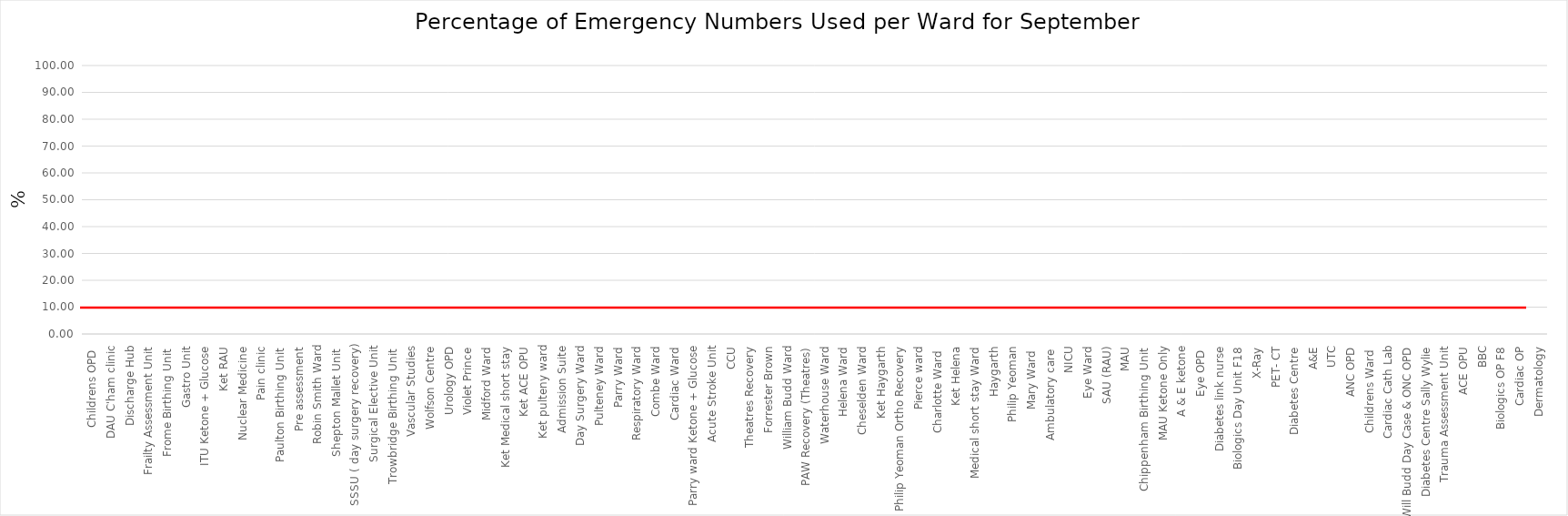
| Category | Series 0 |
|---|---|
| Childrens OPD  | 0 |
| DAU C'ham clinic | 0 |
| Discharge Hub | 0 |
| Frailty Assessment Unit | 0 |
| Frome Birthing Unit  | 0 |
| Gastro Unit | 0 |
| ITU Ketone + Glucose | 0 |
| Ket RAU | 0 |
| Nuclear Medicine | 0 |
| Pain clinic | 0 |
| Paulton Birthing Unit  | 0 |
| Pre assessment | 0 |
| Robin Smith Ward | 0 |
| Shepton Mallet Unit  | 0 |
| SSSU ( day surgery recovery) | 0 |
| Surgical Elective Unit | 0 |
| Trowbridge Birthing Unit  | 0 |
| Vascular Studies | 0 |
| Wolfson Centre | 0 |
| Urology OPD | 0 |
| Violet Prince | 0 |
| Midford Ward | 0 |
| Ket Medical short stay | 0 |
| Ket ACE OPU | 0 |
| Ket pulteny ward | 0 |
| Admission Suite | 0 |
| Day Surgery Ward | 0 |
| Pulteney Ward | 0 |
| Parry Ward | 0 |
| Respiratory Ward | 0 |
| Combe Ward | 0 |
| Cardiac Ward | 0 |
| Parry ward Ketone + Glucose | 0 |
| Acute Stroke Unit | 0 |
| CCU | 0 |
| Theatres Recovery | 0 |
| Forrester Brown | 0 |
| William Budd Ward | 0 |
| PAW Recovery (Theatres) | 0 |
| Waterhouse Ward | 0 |
| Helena Ward | 0 |
| Cheselden Ward | 0 |
| Ket Haygarth | 0 |
| Philip Yeoman Ortho Recovery | 0 |
| Pierce ward | 0 |
| Charlotte Ward  | 0 |
| Ket Helena | 0 |
| Medical short stay Ward | 0 |
| Haygarth | 0 |
| Philip Yeoman | 0 |
| Mary Ward  | 0 |
| Ambulatory care  | 0 |
| NICU | 0 |
| Eye Ward | 0 |
| SAU (RAU) | 0 |
| MAU | 0 |
| Chippenham Birthing Unit  | 0 |
| MAU Ketone Only | 0 |
| A & E ketone | 0 |
| Eye OPD  | 0 |
| Diabetes link nurse | 0 |
| Biologics Day Unit F18 | 0 |
| X-Ray | 0 |
| PET- CT | 0 |
| Diabetes Centre | 0 |
| A&E | 0 |
| UTC | 0 |
| ANC OPD | 0 |
| Childrens Ward  | 0 |
| Cardiac Cath Lab | 0 |
| Will Budd Day Case & ONC OPD | 0 |
| Diabetes Centre Sally Wylie | 0 |
| Trauma Assessment Unit | 0 |
| ACE OPU | 0 |
| BBC | 0 |
| Biologics OP F8 | 0 |
| Cardiac OP | 0 |
| Dermatology | 0 |